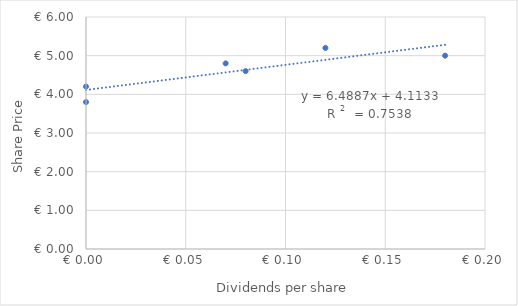
| Category | Series 0 |
|---|---|
| 0.18000000000000002 | 5 |
| 0.08000000000000002 | 4.6 |
| 0.0 | 3.8 |
| 0.06999999999999999 | 4.8 |
| 0.12 | 5.2 |
| 0.0 | 4.2 |